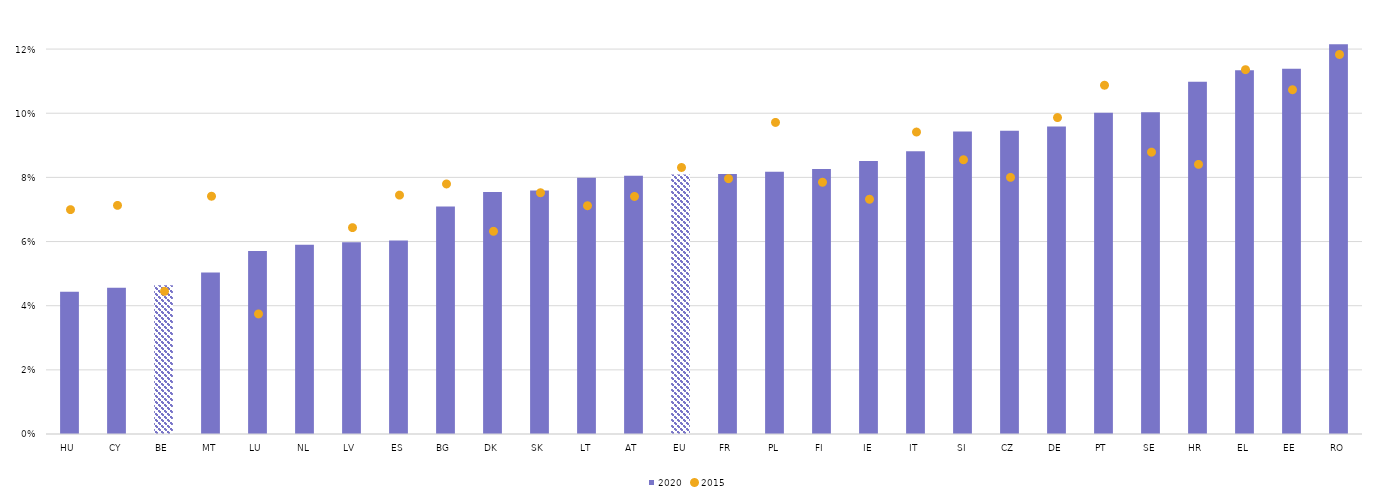
| Category | 2020 |
|---|---|
| HU | 0.044 |
| CY | 0.046 |
| BE | 0.046 |
| MT | 0.05 |
| LU | 0.057 |
| NL | 0.059 |
| LV | 0.06 |
| ES | 0.06 |
| BG | 0.071 |
| DK | 0.075 |
| SK | 0.076 |
| LT | 0.08 |
| AT | 0.081 |
| EU | 0.081 |
| FR | 0.081 |
| PL | 0.082 |
| FI | 0.083 |
| IE | 0.085 |
| IT | 0.088 |
| SI | 0.094 |
| CZ | 0.095 |
| DE | 0.096 |
| PT | 0.1 |
| SE | 0.1 |
| HR | 0.11 |
| EL | 0.113 |
| EE | 0.114 |
| RO | 0.121 |